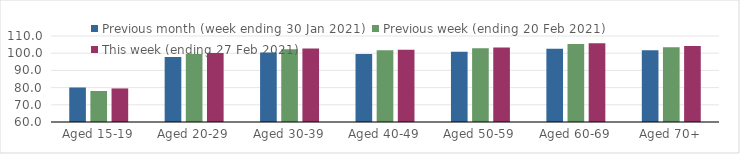
| Category | Previous month (week ending 30 Jan 2021) | Previous week (ending 20 Feb 2021) | This week (ending 27 Feb 2021) |
|---|---|---|---|
| Aged 15-19 | 80.06 | 78.04 | 79.51 |
| Aged 20-29 | 97.86 | 99.55 | 100.09 |
| Aged 30-39 | 100.38 | 102.36 | 102.72 |
| Aged 40-49 | 99.48 | 101.68 | 102.02 |
| Aged 50-59 | 100.89 | 102.86 | 103.35 |
| Aged 60-69 | 102.53 | 105.41 | 105.84 |
| Aged 70+ | 101.75 | 103.48 | 104.19 |